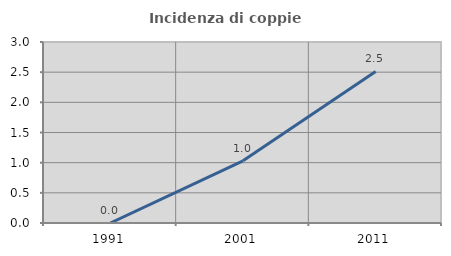
| Category | Incidenza di coppie miste |
|---|---|
| 1991.0 | 0 |
| 2001.0 | 1.031 |
| 2011.0 | 2.511 |